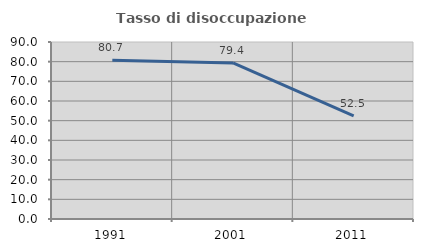
| Category | Tasso di disoccupazione giovanile  |
|---|---|
| 1991.0 | 80.705 |
| 2001.0 | 79.365 |
| 2011.0 | 52.459 |